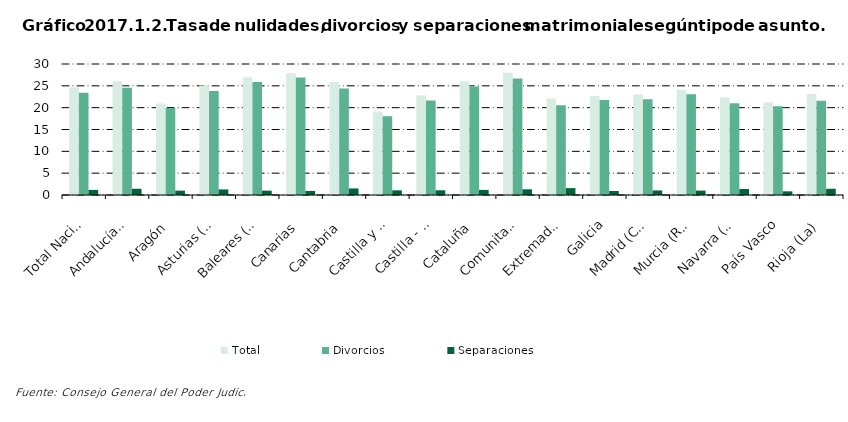
| Category | Total | Divorcios | Separaciones |
|---|---|---|---|
| Total Nacional | 24.614 | 23.414 | 1.17 |
| Andalucía(1) | 26.023 | 24.562 | 1.428 |
| Aragón | 20.967 | 19.943 | 1.001 |
| Asturias (Principado de) | 25.083 | 23.798 | 1.275 |
| Baleares (Illes) | 26.909 | 25.887 | 1.004 |
| Canarias | 27.887 | 26.924 | 0.934 |
| Cantabria | 25.883 | 24.367 | 1.499 |
| Castilla y León | 19.124 | 18.039 | 1.072 |
| Castilla - La Mancha | 22.772 | 21.654 | 1.078 |
| Cataluña | 26.054 | 24.844 | 1.166 |
| Comunitat Valenciana | 28.022 | 26.664 | 1.301 |
| Extremadura | 22.122 | 20.539 | 1.574 |
| Galicia | 22.652 | 21.729 | 0.912 |
| Madrid (Comunidad de) | 23.015 | 21.945 | 1.048 |
| Murcia (Región de) | 24.098 | 23.084 | 1.007 |
| Navarra (Comunidad Foral de) | 22.356 | 20.988 | 1.368 |
| País Vasco | 21.184 | 20.318 | 0.843 |
| Rioja (La) | 23.147 | 21.561 | 1.427 |